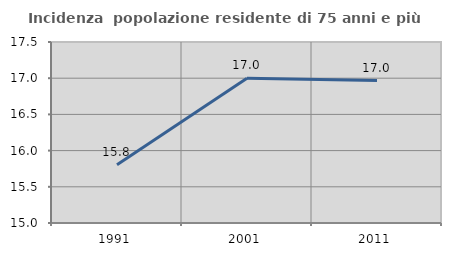
| Category | Incidenza  popolazione residente di 75 anni e più |
|---|---|
| 1991.0 | 15.805 |
| 2001.0 | 17 |
| 2011.0 | 16.968 |